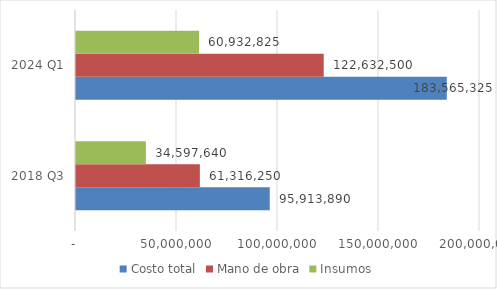
| Category | Costo total | Mano de obra | Insumos |
|---|---|---|---|
| 2018 Q3 | 95913890 | 61316250 | 34597640 |
| 2024 Q1 | 183565325.025 | 122632500 | 60932825.025 |